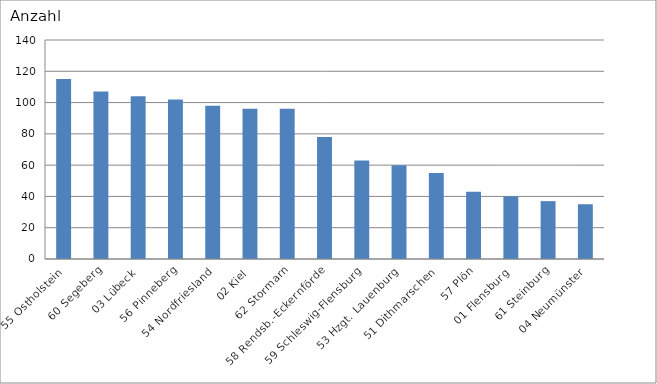
| Category | 55 Ostholstein 60 Segeberg 03 Lübeck 56 Pinneberg 54 Nordfriesland 02 Kiel 62 Stormarn 58 Rendsb.-Eckernförde 59 Schleswig-Flensburg 53 Hzgt. Lauenburg 51 Dithmarschen 57 Plön 01 Flensburg 61 Steinburg 04 Neumünster |
|---|---|
| 55 Ostholstein | 115 |
| 60 Segeberg | 107 |
| 03 Lübeck | 104 |
| 56 Pinneberg | 102 |
| 54 Nordfriesland | 98 |
| 02 Kiel | 96 |
| 62 Stormarn | 96 |
| 58 Rendsb.-Eckernförde | 78 |
| 59 Schleswig-Flensburg | 63 |
| 53 Hzgt. Lauenburg | 60 |
| 51 Dithmarschen | 55 |
| 57 Plön | 43 |
| 01 Flensburg | 40 |
| 61 Steinburg | 37 |
| 04 Neumünster | 35 |